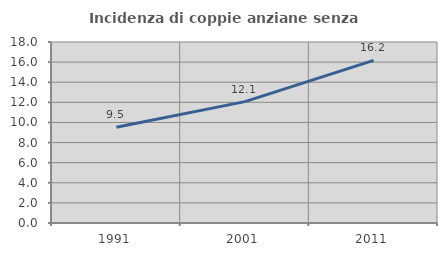
| Category | Incidenza di coppie anziane senza figli  |
|---|---|
| 1991.0 | 9.524 |
| 2001.0 | 12.069 |
| 2011.0 | 16.176 |